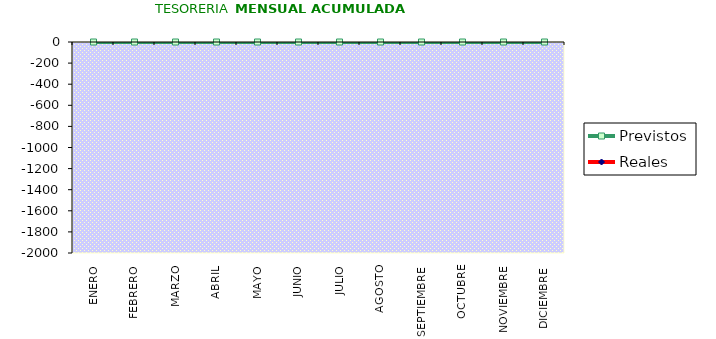
| Category | Reales | Previstos |
|---|---|---|
| ENERO | 0 | 0 |
| FEBRERO | 0 | 0 |
| MARZO | 0 | 0 |
| ABRIL | 0 | 0 |
| MAYO | 0 | 0 |
| JUNIO | 0 | 0 |
| JULIO | 0 | 0 |
| AGOSTO | 0 | 0 |
| SEPTIEMBRE | 0 | 0 |
| OCTUBRE | 0 | 0 |
| NOVIEMBRE | 0 | 0 |
| DICIEMBRE | 0 | 0 |